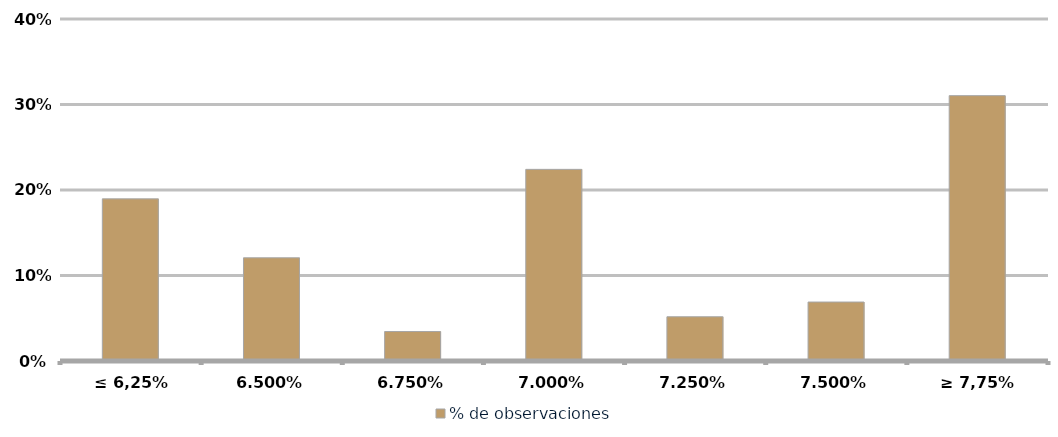
| Category | % de observaciones  |
|---|---|
| ≤ 6,25% | 0.19 |
| 6,50% | 0.121 |
| 6,75% | 0.034 |
| 7,00% | 0.224 |
| 7,25% | 0.052 |
| 7,50% | 0.069 |
| ≥ 7,75% | 0.31 |